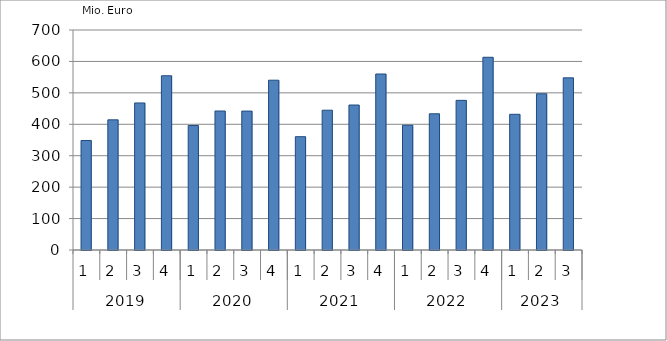
| Category | Ausbaugewerblicher Umsatz3 |
|---|---|
| 0 | 348466.115 |
| 1 | 414145.554 |
| 2 | 467849.207 |
| 3 | 554369.34 |
| 4 | 395996.128 |
| 5 | 442270.528 |
| 6 | 441987.109 |
| 7 | 540250.513 |
| 8 | 360578.959 |
| 9 | 444796.964 |
| 10 | 461290.095 |
| 11 | 559989.337 |
| 12 | 396959.135 |
| 13 | 433420.546 |
| 14 | 476099.112 |
| 15 | 613244.901 |
| 16 | 431755.233 |
| 17 | 497030.878 |
| 18 | 547817.6 |